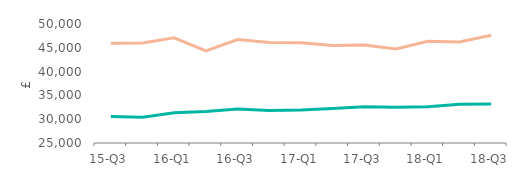
| Category | First-time
buyers | Home movers |
|---|---|---|
| 15-Q3 | 30570 | 45956 |
| 15-Q4 | 30433.5 | 46000 |
| 16-Q1 | 31335 | 47088 |
| 16-Q2 | 31634 | 44359 |
| 16-Q3 | 32140 | 46727.5 |
| 16-Q4 | 31854 | 46092 |
| 17-Q1 | 31951 | 46041 |
| 17-Q2 | 32245 | 45486 |
| 17-Q3 | 32618 | 45594.5 |
| 17-Q4 | 32508 | 44759 |
| 18-Q1 | 32617.5 | 46350 |
| 18-Q2 | 33124.5 | 46215 |
| 18-Q3 | 33195 | 47653 |